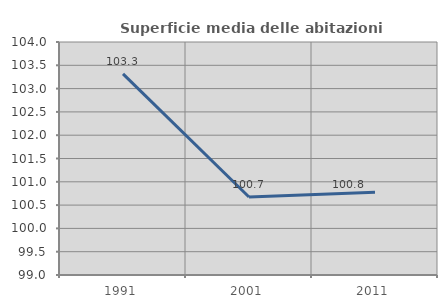
| Category | Superficie media delle abitazioni occupate |
|---|---|
| 1991.0 | 103.317 |
| 2001.0 | 100.675 |
| 2011.0 | 100.774 |